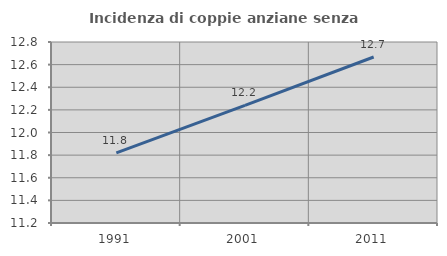
| Category | Incidenza di coppie anziane senza figli  |
|---|---|
| 1991.0 | 11.82 |
| 2001.0 | 12.24 |
| 2011.0 | 12.667 |